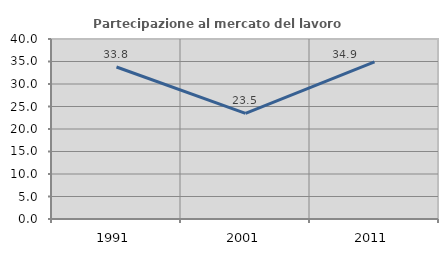
| Category | Partecipazione al mercato del lavoro  femminile |
|---|---|
| 1991.0 | 33.772 |
| 2001.0 | 23.453 |
| 2011.0 | 34.91 |